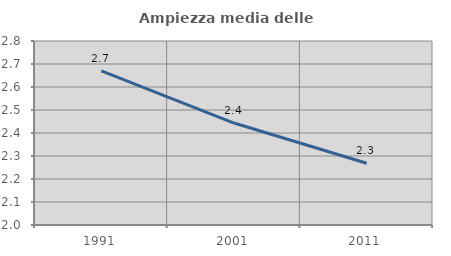
| Category | Ampiezza media delle famiglie |
|---|---|
| 1991.0 | 2.67 |
| 2001.0 | 2.443 |
| 2011.0 | 2.269 |